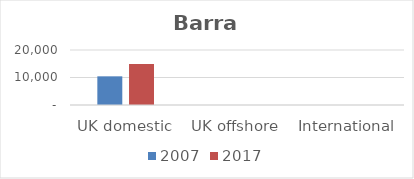
| Category | 2007 | 2017 |
|---|---|---|
| UK domestic | 10427 | 14913 |
| UK offshore | 0 | 0 |
| International | 0 | 0 |